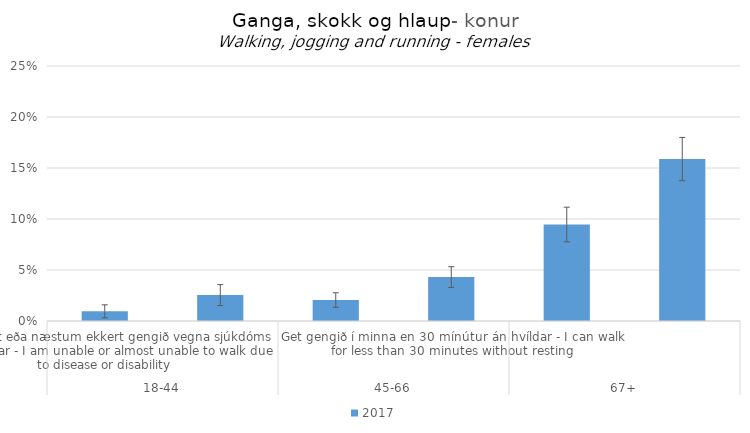
| Category | 2017 |
|---|---|
| 0 | 0.009 |
| 1 | 0.025 |
| 2 | 0.021 |
| 3 | 0.043 |
| 4 | 0.095 |
| 5 | 0.159 |